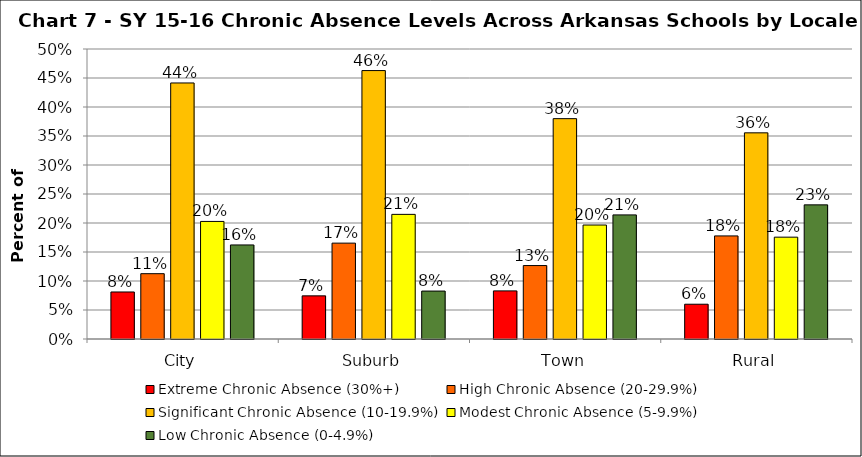
| Category | Extreme Chronic Absence (30%+) | High Chronic Absence (20-29.9%) | Significant Chronic Absence (10-19.9%) | Modest Chronic Absence (5-9.9%) | Low Chronic Absence (0-4.9%) |
|---|---|---|---|---|---|
| 0 | 0.081 | 0.113 | 0.441 | 0.203 | 0.162 |
| 1 | 0.074 | 0.165 | 0.463 | 0.215 | 0.083 |
| 2 | 0.083 | 0.127 | 0.38 | 0.197 | 0.214 |
| 3 | 0.06 | 0.178 | 0.355 | 0.176 | 0.231 |